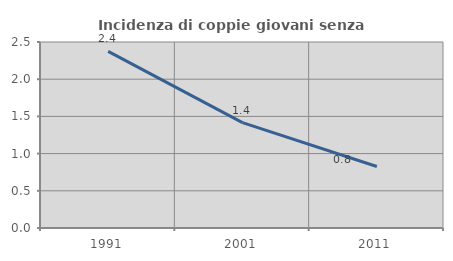
| Category | Incidenza di coppie giovani senza figli |
|---|---|
| 1991.0 | 2.373 |
| 2001.0 | 1.416 |
| 2011.0 | 0.826 |